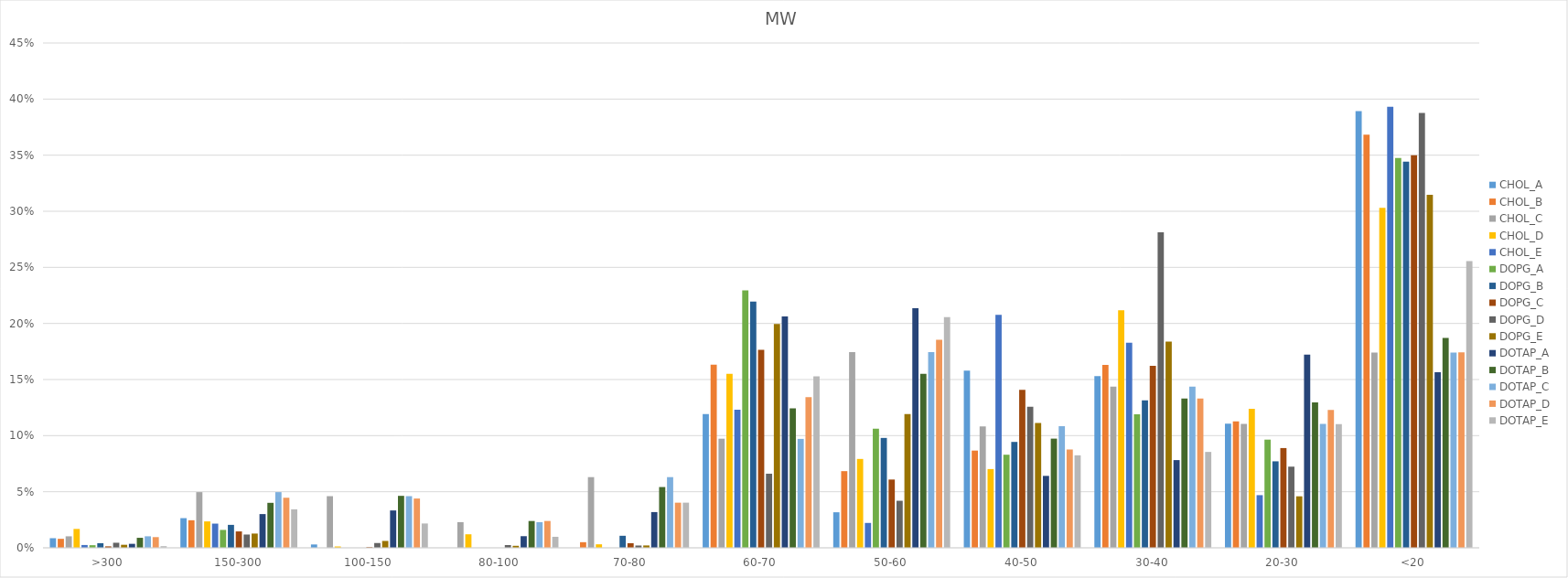
| Category | CHOL_A | CHOL_B | CHOL_C | CHOL_D | CHOL_E | DOPG_A | DOPG_B | DOPG_C | DOPG_D | DOPG_E | DOTAP_A | DOTAP_B | DOTAP_C | DOTAP_D | DOTAP_E |
|---|---|---|---|---|---|---|---|---|---|---|---|---|---|---|---|
| >300 | 0.009 | 0.008 | 0.01 | 0.017 | 0.003 | 0.002 | 0.004 | 0.001 | 0.005 | 0.003 | 0.004 | 0.009 | 0.01 | 0.01 | 0.001 |
| 150-300 | 0.026 | 0.025 | 0.05 | 0.024 | 0.022 | 0.016 | 0.02 | 0.015 | 0.012 | 0.013 | 0.03 | 0.04 | 0.05 | 0.045 | 0.034 |
| 100-150 | 0.003 | 0 | 0.046 | 0.001 | 0 | 0 | 0 | 0.001 | 0.004 | 0.006 | 0.033 | 0.046 | 0.046 | 0.044 | 0.022 |
| 80-100 | 0 | 0 | 0.023 | 0.012 | 0 | 0 | 0 | 0 | 0.002 | 0.002 | 0.01 | 0.024 | 0.023 | 0.024 | 0.01 |
| 70-80 | 0 | 0.005 | 0.063 | 0.003 | 0 | 0 | 0.011 | 0.004 | 0.002 | 0.002 | 0.032 | 0.054 | 0.063 | 0.04 | 0.04 |
| 60-70 | 0.119 | 0.163 | 0.097 | 0.155 | 0.123 | 0.229 | 0.219 | 0.176 | 0.066 | 0.2 | 0.206 | 0.124 | 0.097 | 0.134 | 0.153 |
| 50-60 | 0.032 | 0.068 | 0.174 | 0.079 | 0.022 | 0.106 | 0.098 | 0.061 | 0.042 | 0.119 | 0.214 | 0.155 | 0.175 | 0.186 | 0.206 |
| 40-50 | 0.158 | 0.087 | 0.108 | 0.07 | 0.208 | 0.083 | 0.094 | 0.141 | 0.126 | 0.111 | 0.064 | 0.097 | 0.108 | 0.088 | 0.082 |
| 30-40 | 0.153 | 0.163 | 0.144 | 0.212 | 0.183 | 0.119 | 0.132 | 0.162 | 0.281 | 0.184 | 0.078 | 0.133 | 0.144 | 0.133 | 0.085 |
| 20-30 | 0.111 | 0.113 | 0.111 | 0.124 | 0.047 | 0.096 | 0.077 | 0.089 | 0.072 | 0.046 | 0.172 | 0.13 | 0.111 | 0.123 | 0.11 |
| <20 | 0.389 | 0.368 | 0.174 | 0.303 | 0.393 | 0.348 | 0.344 | 0.35 | 0.388 | 0.315 | 0.156 | 0.187 | 0.174 | 0.174 | 0.256 |